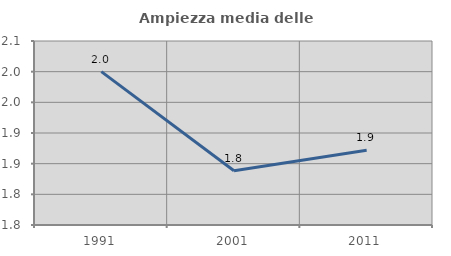
| Category | Ampiezza media delle famiglie |
|---|---|
| 1991.0 | 2 |
| 2001.0 | 1.838 |
| 2011.0 | 1.872 |